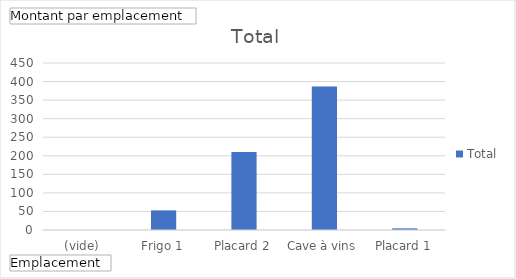
| Category | Total |
|---|---|
| (vide) | 0 |
| Frigo 1 | 52.845 |
| Placard 2 | 210.25 |
| Cave à vins | 387 |
| Placard 1 | 4.4 |